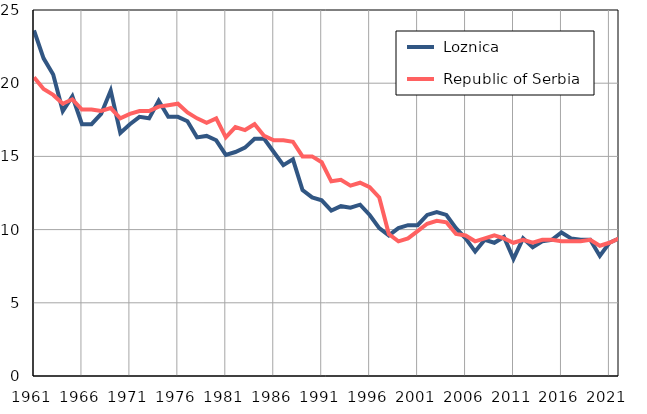
| Category |  Loznica |  Republic of Serbia |
|---|---|---|
| 1961.0 | 23.6 | 20.4 |
| 1962.0 | 21.7 | 19.6 |
| 1963.0 | 20.6 | 19.2 |
| 1964.0 | 18.1 | 18.6 |
| 1965.0 | 19.1 | 18.9 |
| 1966.0 | 17.2 | 18.2 |
| 1967.0 | 17.2 | 18.2 |
| 1968.0 | 17.9 | 18.1 |
| 1969.0 | 19.5 | 18.3 |
| 1970.0 | 16.6 | 17.6 |
| 1971.0 | 17.2 | 17.9 |
| 1972.0 | 17.7 | 18.1 |
| 1973.0 | 17.6 | 18.1 |
| 1974.0 | 18.8 | 18.4 |
| 1975.0 | 17.7 | 18.5 |
| 1976.0 | 17.7 | 18.6 |
| 1977.0 | 17.4 | 18 |
| 1978.0 | 16.3 | 17.6 |
| 1979.0 | 16.4 | 17.3 |
| 1980.0 | 16.1 | 17.6 |
| 1981.0 | 15.1 | 16.3 |
| 1982.0 | 15.3 | 17 |
| 1983.0 | 15.6 | 16.8 |
| 1984.0 | 16.2 | 17.2 |
| 1985.0 | 16.2 | 16.4 |
| 1986.0 | 15.3 | 16.1 |
| 1987.0 | 14.4 | 16.1 |
| 1988.0 | 14.8 | 16 |
| 1989.0 | 12.7 | 15 |
| 1990.0 | 12.2 | 15 |
| 1991.0 | 12 | 14.6 |
| 1992.0 | 11.3 | 13.3 |
| 1993.0 | 11.6 | 13.4 |
| 1994.0 | 11.5 | 13 |
| 1995.0 | 11.7 | 13.2 |
| 1996.0 | 11 | 12.9 |
| 1997.0 | 10.1 | 12.2 |
| 1998.0 | 9.6 | 9.7 |
| 1999.0 | 10.1 | 9.2 |
| 2000.0 | 10.3 | 9.4 |
| 2001.0 | 10.3 | 9.9 |
| 2002.0 | 11 | 10.4 |
| 2003.0 | 11.2 | 10.6 |
| 2004.0 | 11 | 10.5 |
| 2005.0 | 10.1 | 9.7 |
| 2006.0 | 9.4 | 9.6 |
| 2007.0 | 8.5 | 9.2 |
| 2008.0 | 9.3 | 9.4 |
| 2009.0 | 9.1 | 9.6 |
| 2010.0 | 9.5 | 9.4 |
| 2011.0 | 8 | 9.1 |
| 2012.0 | 9.4 | 9.3 |
| 2013.0 | 8.8 | 9.1 |
| 2014.0 | 9.2 | 9.3 |
| 2015.0 | 9.3 | 9.3 |
| 2016.0 | 9.8 | 9.2 |
| 2017.0 | 9.4 | 9.2 |
| 2018.0 | 9.3 | 9.2 |
| 2019.0 | 9.3 | 9.3 |
| 2020.0 | 8.2 | 8.9 |
| 2021.0 | 9.1 | 9.1 |
| 2022.0 | 9.4 | 9.4 |